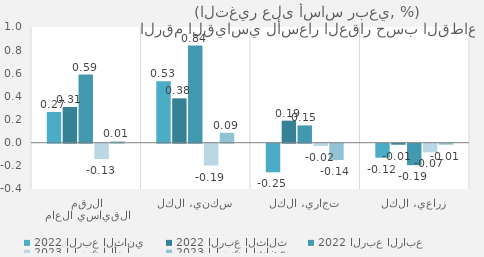
| Category | 2022 | 2023 |
|---|---|---|
| الرقم القياسي العام | 0.589 | 0.012 |
| سكني، الكل | 0.839 | 0.086 |
| تجاري، الكل | 0.149 | -0.141 |
| زراعي، الكل | -0.186 | -0.009 |